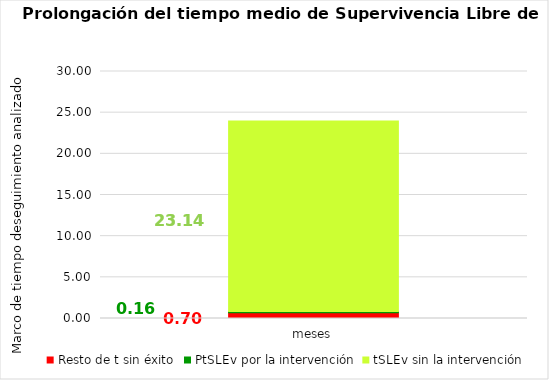
| Category | Resto de t sin éxito | PtSLEv por la intervención | tSLEv sin la intervención |
|---|---|---|---|
| meses | 0.699 | 0.161 | 23.14 |